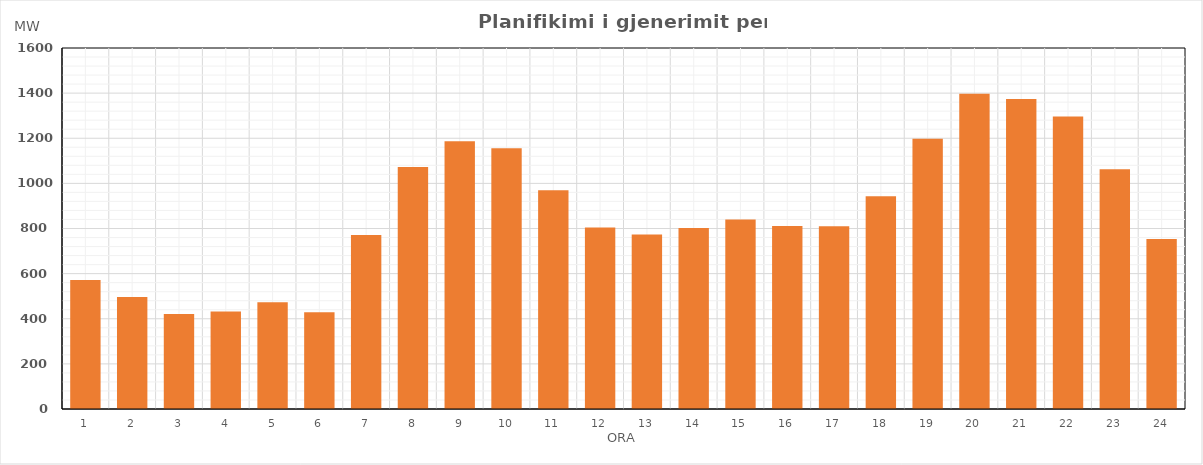
| Category | Max (MW) |
|---|---|
| 0 | 571.98 |
| 1 | 496.11 |
| 2 | 421 |
| 3 | 432.2 |
| 4 | 472.69 |
| 5 | 429.29 |
| 6 | 771.38 |
| 7 | 1072.91 |
| 8 | 1186.27 |
| 9 | 1155.77 |
| 10 | 969.41 |
| 11 | 804.2 |
| 12 | 773.93 |
| 13 | 801.9 |
| 14 | 840.43 |
| 15 | 811.14 |
| 16 | 810.33 |
| 17 | 942.56 |
| 18 | 1197.28 |
| 19 | 1396.69 |
| 20 | 1374.3 |
| 21 | 1296.2 |
| 22 | 1062.7 |
| 23 | 753.94 |